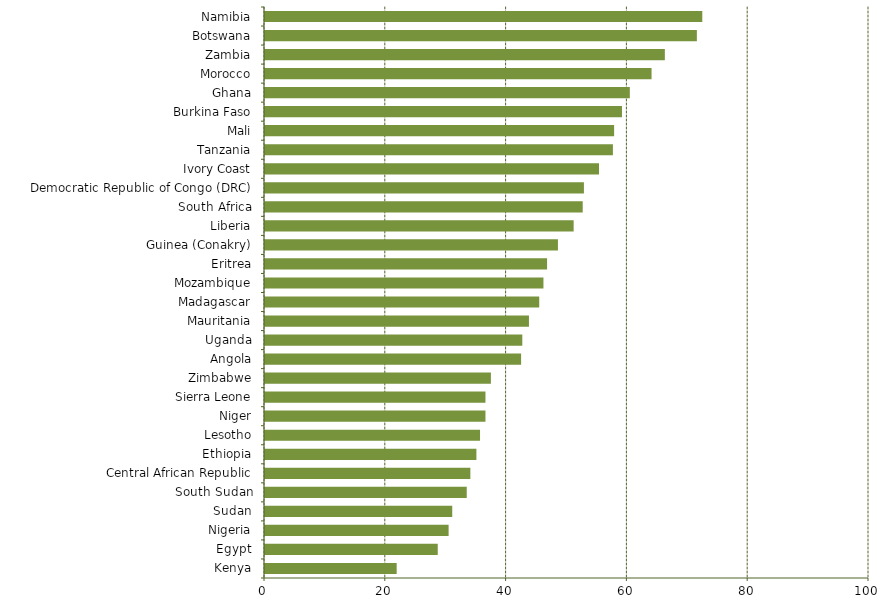
| Category | Series 0 |
|---|---|
| Kenya | 21.8 |
| Egypt | 28.6 |
| Nigeria | 30.4 |
| Sudan | 31 |
| South Sudan | 33.4 |
| Central African Republic | 34 |
| Ethiopia | 35 |
| Lesotho | 35.6 |
| Niger | 36.5 |
| Sierra Leone | 36.5 |
| Zimbabwe | 37.4 |
| Angola | 42.4 |
| Uganda | 42.6 |
| Mauritania | 43.7 |
| Madagascar | 45.4 |
| Mozambique | 46.1 |
| Eritrea | 46.7 |
| Guinea (Conakry) | 48.5 |
| Liberia | 51.1 |
| South Africa | 52.6 |
| Democratic Republic of Congo (DRC) | 52.8 |
| Ivory Coast | 55.3 |
| Tanzania | 57.6 |
| Mali | 57.8 |
| Burkina Faso | 59.1 |
| Ghana | 60.4 |
| Morocco | 64 |
| Zambia | 66.2 |
| Botswana | 71.5 |
| Namibia | 72.4 |